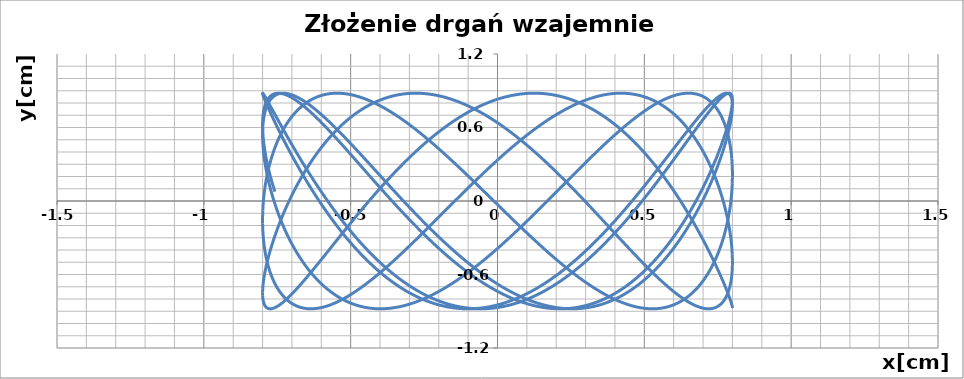
| Category | Zlożenie drgań wzajemnie prostopadłych |
|---|---|
| 0.8 | -0.873 |
| 0.7996728383013441 | -0.865 |
| 0.7986916207923187 | -0.853 |
| 0.7970571500148915 | -0.839 |
| 0.7947707628096523 | -0.821 |
| 0.7918343292224058 | -0.8 |
| 0.788250250974653 | -0.776 |
| 0.7840214594992129 | -0.75 |
| 0.7791514135425914 | -0.72 |
| 0.773644096336058 | -0.688 |
| 0.7675040123377433 | -0.653 |
| 0.7607361835484243 | -0.616 |
| 0.7533461454040083 | -0.576 |
| 0.7453399422480764 | -0.535 |
| 0.7367241223881895 | -0.491 |
| 0.7275057327399992 | -0.446 |
| 0.7176923130635458 | -0.399 |
| 0.7072918897964569 | -0.35 |
| 0.6963129694890893 | -0.3 |
| 0.6847645318469862 | -0.249 |
| 0.6726560223863368 | -0.197 |
| 0.6599973447084498 | -0.144 |
| 0.6467988523995545 | -0.091 |
| 0.6330713405625599 | -0.038 |
| 0.6188260369876929 | 0.016 |
| 0.6040745929692424 | 0.07 |
| 0.5888290737759149 | 0.123 |
| 0.573101948782601 | 0.176 |
| 0.5569060812716201 | 0.228 |
| 0.5402547179117876 | 0.28 |
| 0.5231614779239077 | 0.33 |
| 0.5056403419415553 | 0.379 |
| 0.48770564057625637 | 0.427 |
| 0.46937204269642 | 0.473 |
| 0.45065454342960803 | 0.518 |
| 0.43156845189795734 | 0.56 |
| 0.41212937869678345 | 0.6 |
| 0.39235322312660825 | 0.639 |
| 0.3722561601890553 | 0.674 |
| 0.3518546273572454 | 0.708 |
| 0.3311653111315202 | 0.738 |
| 0.31020513339148065 | 0.766 |
| 0.28899123755551054 | 0.791 |
| 0.26754097455910236 | 0.813 |
| 0.24587188866345178 | 0.832 |
| 0.2240017031059341 | 0.848 |
| 0.2019483056041915 | 0.861 |
| 0.17972973372569345 | 0.87 |
| 0.15736416013473367 | 0.877 |
| 0.1348698777289306 | 0.88 |
| 0.11226528467738939 | 0.879 |
| 0.08956886937276046 | 0.876 |
| 0.06679919530950444 | 0.869 |
| 0.04397488590073284 | 0.859 |
| 0.021114609246037332 | 0.846 |
| -0.0017629371372264759 | 0.83 |
| -0.02463904160671901 | 0.81 |
| -0.04749499369944862 | 0.788 |
| -0.07031209943513714 | 0.762 |
| -0.09307169660610766 | 0.734 |
| -0.1157551700411817 | 0.703 |
| -0.1383439668311087 | 0.669 |
| -0.16081961150306767 | 0.633 |
| -0.1831637211318351 | 0.595 |
| -0.20535802037525863 | 0.554 |
| -0.22738435642173527 | 0.511 |
| -0.24922471383747524 | 0.467 |
| -0.27086122930140005 | 0.42 |
| -0.29227620621562894 | 0.372 |
| -0.31345212917960247 | 0.323 |
| -0.3343716783160013 | 0.273 |
| -0.3550177434367494 | 0.221 |
| -0.3753734380375081 | 0.169 |
| -0.39542211310922004 | 0.116 |
| -0.41514737075540487 | 0.062 |
| -0.4345330776040672 | 0.008 |
| -0.45356337800325114 | -0.045 |
| -0.4722227069894466 | -0.099 |
| -0.4904958030182351 | -0.152 |
| -0.5083677204467759 | -0.205 |
| -0.5258238417579086 | -0.256 |
| -0.542849889515883 | -0.307 |
| -0.5594319380439343 | -0.357 |
| -0.5755564248141536 | -0.405 |
| -0.5912101615403362 | -0.452 |
| -0.606380344964738 | -0.498 |
| -0.6210545673299144 | -0.541 |
| -0.6352208265270765 | -0.582 |
| -0.648867535912668 | -0.621 |
| -0.6619835337851295 | -0.658 |
| -0.6745580925141024 | -0.693 |
| -0.6865809273146026 | -0.724 |
| -0.6980422046589903 | -0.754 |
| -0.7089325503198535 | -0.78 |
| -0.7192430570372284 | -0.803 |
| -0.7289652918038864 | -0.824 |
| -0.7380913027627248 | -0.841 |
| -0.7466136257106255 | -0.855 |
| -0.7545252902034583 | -0.866 |
| -0.7618198252572363 | -0.874 |
| -0.7684912646407618 | -0.879 |
| -0.7745341517554319 | -0.88 |
| -0.7799435440982134 | -0.878 |
| -0.7847150173041378 | -0.873 |
| -0.7888446687650067 | -0.864 |
| -0.7923291208213534 | -0.852 |
| -0.7951655235250439 | -0.837 |
| -0.7973515569702614 | -0.819 |
| -0.7988854331909679 | -0.798 |
| -0.7997658976232888 | -0.774 |
| -0.7999922301316255 | -0.747 |
| -0.7995642455976587 | -0.718 |
| -0.798482294071756 | -0.685 |
| -0.796747260486665 | -0.65 |
| -0.7943605639337235 | -0.613 |
| -0.7913241565021769 | -0.573 |
| -0.7876405216825586 | -0.531 |
| -0.7833126723354301 | -0.487 |
| -0.7783441482271516 | -0.442 |
| -0.7727390131346908 | -0.395 |
| -0.7665018515218428 | -0.346 |
| -0.7596377647895776 | -0.296 |
| -0.7521523671035828 | -0.245 |
| -0.7440517808024135 | -0.193 |
| -0.735342631390006 | -0.14 |
| -0.7260320421166492 | -0.087 |
| -0.7161276281528484 | -0.033 |
| -0.7056374903608451 | 0.021 |
| -0.6945702086688872 | 0.074 |
| -0.6829348350536695 | 0.128 |
| -0.6707408861366831 | 0.18 |
| -0.6579983354005304 | 0.233 |
| -0.6447176050315715 | 0.284 |
| -0.6309095573955734 | 0.334 |
| -0.616585486153336 | 0.383 |
| -0.6017571070235571 | 0.431 |
| -0.5864365482004978 | 0.477 |
| -0.5706363404342806 | 0.521 |
| -0.5543694067819346 | 0.563 |
| -0.537649052037575 | 0.604 |
| -0.5204889518503515 | 0.642 |
| -0.5029031415390804 | 0.677 |
| -0.484906004612696 | 0.71 |
| -0.46651226100591753 | 0.741 |
| -0.44773695503975275 | 0.768 |
| -0.42859544311668324 | 0.793 |
| -0.409103381160598 | 0.815 |
| -0.38927671181174683 | 0.834 |
| -0.36913165138718607 | 0.849 |
| -0.3486846766173871 | 0.862 |
| -0.3279525111698445 | 0.871 |
| -0.3069521119707205 | 0.877 |
| -0.28570065533569977 | 0.88 |
| -0.26421552292141154 | 0.879 |
| -0.24251428750889836 | 0.876 |
| -0.22061469863076077 | 0.868 |
| -0.19853466805374184 | 0.858 |
| -0.17629225512861652 | 0.845 |
| -0.15390565201937173 | 0.828 |
| -0.1313931688237584 | 0.808 |
| -0.10877321859738465 | 0.786 |
| -0.08606430229359867 | 0.76 |
| -0.06328499363148406 | 0.732 |
| -0.040453923904328976 | 0.7 |
| -0.017589766741019277 | 0.667 |
| 0.0052887771672053 | 0.63 |
| 0.028162995362126 | 0.592 |
| 0.05101417892354049 | 0.551 |
| 0.07382363777137599 | 0.508 |
| 0.09657271595237445 | 0.463 |
| 0.11924280689888661 | 0.417 |
| 0.14181536864725558 | 0.368 |
| 0.16427193900336778 | 0.319 |
| 0.1865941506429667 | 0.268 |
| 0.20876374613435514 | 0.217 |
| 0.23076259287123724 | 0.164 |
| 0.25257269790344355 | 0.111 |
| 0.2741762226534494 | 0.058 |
| 0.2955554975066192 | 0.004 |
| 0.31669303626325984 | -0.05 |
| 0.33757155044066084 | -0.103 |
| 0.35817396341341085 | -0.156 |
| 0.37848342438044913 | -0.209 |
| 0.39848332214740384 | -0.261 |
| 0.418157298712959 | -0.311 |
| 0.4374892626481332 | -0.361 |
| 0.45646340225752874 | -0.409 |
| 0.4750641985117809 | -0.456 |
| 0.4932764377406443 | -0.501 |
| 0.5110852240763121 | -0.544 |
| 0.5284759916368128 | -0.585 |
| 0.5454345164395072 | -0.624 |
| 0.5619469280349405 | -0.661 |
| 0.5779997208515487 | -0.695 |
| 0.5935797652419148 | -0.727 |
| 0.6086743182215709 | -0.756 |
| 0.6232710338915324 | -0.782 |
| 0.6373579735360657 | -0.805 |
| 0.650923615387415 | -0.825 |
| 0.6639568640494998 | -0.842 |
| 0.6764470595728935 | -0.856 |
| 0.688383986173635 | -0.867 |
| 0.6997578805887661 | -0.875 |
| 0.7105594400617439 | -0.879 |
| 0.7207798299512045 | -0.88 |
| 0.7304106909568564 | -0.878 |
| 0.739444145956583 | -0.872 |
| 0.7478728064491786 | -0.863 |
| 0.7556897785974329 | -0.851 |
| 0.7628886688666299 | -0.836 |
| 0.7694635892538473 | -0.818 |
| 0.7754091621037792 | -0.796 |
| 0.7807205245071426 | -0.772 |
| 0.7853933322780728 | -0.745 |
| 0.7894237635072499 | -0.715 |
| 0.7928085216878559 | -0.682 |
| 0.7955448384118011 | -0.647 |
| 0.7976304756340166 | -0.61 |
| 0.7990637275029616 | -0.57 |
| 0.7998434217558459 | -0.528 |
| 0.7999689206774291 | -0.484 |
| 0.79944012162161 | -0.438 |
| 0.7982574570953824 | -0.391 |
| 0.7964218944050843 | -0.342 |
| 0.7939349348652353 | -0.292 |
| 0.790798612570604 | -0.241 |
| 0.7870154927325143 | -0.188 |
| 0.782588669580747 | -0.136 |
| 0.7775217638327575 | -0.082 |
| 0.771818919732274 | -0.029 |
| 0.7654848016597043 | 0.025 |
| 0.7585245903171187 | 0.079 |
| 0.7509439784909322 | 0.132 |
| 0.7427491663957491 | 0.185 |
| 0.7339468566031824 | 0.237 |
| 0.7245442485597919 | 0.288 |
| 0.7145490326986255 | 0.338 |
| 0.703969384149183 | 0.387 |
| 0.6928139560509396 | 0.435 |
| 0.6810918724759114 | 0.481 |
| 0.6688127209660328 | 0.525 |
| 0.6559865446914688 | 0.567 |
| 0.6426238342362638 | 0.607 |
| 0.628735519018044 | 0.645 |
| 0.6143329583488069 | 0.68 |
| 0.5994279321440843 | 0.713 |
| 0.5840326312881069 | 0.743 |
| 0.5681596476628227 | 0.77 |
| 0.5518219638489454 | 0.795 |
| 0.5350329425074476 | 0.816 |
| 0.5178063154501794 | 0.835 |
| 0.5001561724085681 | 0.85 |
| 0.4820969495095606 | 0.863 |
| 0.46364341746825705 | 0.872 |
| 0.4448106695068795 | 0.877 |
| 0.42561410900996144 | 0.88 |
| 0.4060694369258537 | 0.879 |
| 0.3861926389248547 | 0.875 |
| 0.3659999723244568 | 0.868 |
| 0.34550795279242585 | 0.857 |
| 0.3247333408385574 | 0.843 |
| 0.30369312810619087 | 0.827 |
| 0.2824045234746722 | 0.807 |
| 0.2608849389841319 | 0.784 |
| 0.2391519755941134 | 0.758 |
| 0.21722340878766278 | 0.729 |
| 0.1951171740326958 | 0.698 |
| 0.17285135211249578 | 0.664 |
| 0.15044415433736405 | 0.627 |
| 0.12791390764951904 | 0.588 |
| 0.10527903963340178 | 0.547 |
| 0.08255806344368688 | 0.504 |
| 0.05976956266328699 | 0.459 |
| 0.036932176103765 | 0.413 |
| 0.01406458256057008 | 0.364 |
| -0.00881451446442835 | 0.315 |
| -0.03168640206061497 | 0.264 |
| -0.05453237321399405 | 0.213 |
| -0.07733374210774274 | 0.16 |
| -0.10007185940541297 | 0.107 |
| -0.12272812750430634 | 0.053 |
| -0.14528401574653244 | 0 |
| -0.16772107557530916 | -0.054 |
| -0.1900209556241232 | -0.107 |
| -0.21216541672638028 | -0.161 |
| -0.23413634683330808 | -0.213 |
| -0.25591577582786673 | -0.265 |
| -0.277485890222595 | -0.315 |
| -0.29882904772932617 | -0.365 |
| -0.31992779168890145 | -0.413 |
| -0.34076486534903494 | -0.46 |
| -0.361323225978695 | -0.505 |
| -0.38158605880741614 | -0.548 |
| -0.4015367907781813 | -0.589 |
| -0.4211591041025856 | -0.628 |
| -0.4404369496072345 | -0.664 |
| -0.4593545598604224 | -0.698 |
| -0.4778964620683859 | -0.729 |
| -0.49604749073057053 | -0.758 |
| -0.5137928000435504 | -0.784 |
| -0.5311178760434826 | -0.807 |
| -0.5480085484771314 | -0.827 |
| -0.5644510023917858 | -0.844 |
| -0.5804317894345646 | -0.857 |
| -0.5959378388518792 | -0.868 |
| -0.6109564681800643 | -0.875 |
| -0.6254753936184126 | -0.879 |
| -0.6394827400761508 | -0.88 |
| -0.6529670508851285 | -0.877 |
| -0.6659172971702705 | -0.872 |
| -0.6783228868701466 | -0.862 |
| -0.6901736734002584 | -0.85 |
| -0.7014599639519764 | -0.835 |
| -0.7121725274203301 | -0.816 |
| -0.722302601954167 | -0.795 |
| -0.7318419021225059 | -0.77 |
| -0.7407826256912302 | -0.743 |
| -0.749117460004564 | -0.712 |
| -0.7568395879661284 | -0.68 |
| -0.7639426936146695 | -0.644 |
| -0.770420967289914 | -0.606 |
| -0.7762691103843116 | -0.566 |
| -0.7814823396767903 | -0.524 |
| -0.7860563912449725 | -0.48 |
| -0.7899875239526576 | -0.434 |
| -0.7932725225097091 | -0.387 |
| -0.7959087001018569 | -0.338 |
| -0.7978939005882539 | -0.288 |
| -0.7992265002649913 | -0.236 |
| -0.7999054091931349 | -0.184 |
| -0.7999300720901892 | -0.131 |
| -0.7993004687842657 | -0.078 |
| -0.7980171142305822 | -0.024 |
| -0.7960810580902784 | 0.029 |
| -0.7934938838718926 | 0.083 |
| -0.790257707636205 | 0.136 |
| -0.7863751762655018 | 0.189 |
| -0.7818494652986789 | 0.241 |
| -0.7766842763339551 | 0.292 |
| -0.7708838340013188 | 0.342 |
| -0.7644528825071872 | 0.391 |
| -0.7573966817540962 | 0.439 |
| -0.7497210030386076 | 0.484 |
| -0.7414321243309389 | 0.528 |
| -0.7325368251401846 | 0.57 |
| -0.7230423809693275 | 0.61 |
| -0.7129565573645746 | 0.648 |
| -0.7022876035638835 | 0.683 |
| -0.6910442457498763 | 0.715 |
| -0.6792356799126527 | 0.745 |
| -0.6668715643283591 | 0.772 |
| -0.6539620116596386 | 0.797 |
| -0.6405175806844396 | 0.818 |
| -0.6265492676599522 | 0.836 |
| -0.6120684973287155 | 0.851 |
| -0.59708711357428 | 0.863 |
| -0.5816173697340371 | 0.872 |
| -0.5656719185771691 | 0.878 |
| -0.549263801955894 | 0.88 |
| -0.5324064401384714 | 0.879 |
| -0.515113620832721 | 0.875 |
| -0.49739948790898947 | 0.867 |
| -0.4792785298318216 | 0.856 |
| -0.46076556780978106 | 0.842 |
| -0.44187574367312216 | 0.825 |
| -0.4226245074892269 | 0.805 |
| -0.403027604925921 | 0.782 |
| -0.38310106437303293 | 0.756 |
| -0.3628611838327031 | 0.727 |
| -0.3423245175891757 | 0.695 |
| -0.32150786266898185 | 0.661 |
| -0.3004282451025828 | 0.624 |
| -0.2791029059987038 | 0.585 |
| -0.25754928744276157 | 0.544 |
| -0.2357850182308981 | 0.501 |
| -0.21382789945132946 | 0.456 |
| -0.19169588992475084 | 0.409 |
| -0.16940709151573796 | 0.361 |
| -0.1469797343271648 | 0.311 |
| -0.12443216178971402 | 0.26 |
| -0.10178281565871826 | 0.208 |
| -0.07905022093055884 | 0.156 |
| -0.056252970691002484 | 0.103 |
| -0.03340971090783467 | 0.049 |
| -0.010539125180233496 | -0.005 |
| 0.012340080542608468 | -0.058 |
| 0.03520919326117075 | -0.112 |
| 0.05804950823104254 | -0.165 |
| 0.0808423442616168 | -0.217 |
| 0.10356905899551255 | -0.269 |
| 0.12621106415623537 | -0.32 |
| 0.14874984075161043 | -0.369 |
| 0.17116695422054912 | -0.417 |
| 0.193444069510745 | -0.463 |
| 0.2155629660750007 | -0.508 |
| 0.23750555277388674 | -0.551 |
| 0.25925388267255844 | -0.592 |
| 0.2807901677196343 | -0.631 |
| 0.3020967932961149 | -0.667 |
| 0.32315633262246485 | -0.701 |
| 0.3439515610120343 | -0.732 |
| 0.36446546995921353 | -0.76 |
| 0.38468128105075816 | -0.786 |
| 0.40458245968892853 | -0.809 |
| 0.4241527286152044 | -0.828 |
| 0.44337608122352085 | -0.845 |
| 0.46223679465214706 | -0.858 |
| 0.4807194426434741 | -0.869 |
| 0.49880890816121826 | -0.876 |
| 0.5164903957547179 | -0.879 |
| 0.5337494436601807 | -0.88 |
| 0.5505719356290322 | -0.877 |
| 0.566944112473651 | -0.871 |
| 0.5828525833210698 | -0.862 |
| 0.5982843365654263 | -0.849 |
| 0.6132267505102078 | -0.833 |
| 0.6276676036915927 | -0.815 |
| 0.6415950848744408 | -0.793 |
| 0.6549978027127459 | -0.768 |
| 0.6678647950666723 | -0.74 |
| 0.6801855379685332 | -0.71 |
| 0.6919499542303864 | -0.677 |
| 0.7031484216862123 | -0.641 |
| 0.7137717810619213 | -0.603 |
| 0.7238113434667695 | -0.563 |
| 0.7332588975000298 | -0.521 |
| 0.7421067159671383 | -0.477 |
| 0.7503475621997966 | -0.431 |
| 0.7579746959748758 | -0.383 |
| 0.7649818790272719 | -0.334 |
| 0.7713633801522085 | -0.284 |
| 0.7771139798928164 | -0.232 |
| 0.7822289748091467 | -0.18 |
| 0.7867041813251352 | -0.127 |
| 0.7905359391503687 | -0.074 |
| 0.7937211142738496 | -0.02 |
| 0.7962571015273181 | 0.034 |
| 0.7981418267160301 | 0.087 |
| 0.7993737483152499 | 0.141 |
| 0.7999518587310702 | 0.193 |
| 0.7998756851245269 | 0.245 |
| 0.799145289798336 | 0.296 |
| 0.7977612701459367 | 0.346 |
| 0.7957247581628801 | 0.395 |
| 0.7930374195209656 | 0.442 |
| 0.7897014522058803 | 0.488 |
| 0.785719584719458 | 0.532 |
| 0.7810950738480253 | 0.573 |
| 0.7758317019986634 | 0.613 |
| 0.7699337741055583 | 0.651 |
| 0.7634061141089805 | 0.685 |
| 0.756254061009762 | 0.718 |
| 0.7484834645025052 | 0.748 |
| 0.7401006801910923 | 0.775 |
| 0.7311125643904092 | 0.799 |
| 0.7215264685185399 | 0.82 |
| 0.7113502330840055 | 0.838 |
| 0.7005921812729833 | 0.853 |
| 0.6892611121417359 | 0.864 |
| 0.6773662934198239 | 0.873 |
| 0.6649174539299922 | 0.878 |
| 0.6519247756309262 | 0.88 |
| 0.6383988852893818 | 0.879 |
| 0.6243508457885105 | 0.874 |
| 0.609792147079474 | 0.866 |
| 0.5947346967837732 | 0.855 |
| 0.5791908104539499 | 0.841 |
| 0.5631732015006404 | 0.824 |
| 0.5466949707942307 | 0.803 |
| 0.5297695959495906 | 0.78 |
| 0.5124109203026838 | 0.753 |
| 0.49463314158803534 | 0.724 |
| 0.4764508003263533 | 0.692 |
| 0.4578787679317715 | 0.658 |
| 0.4389322345484497 | 0.621 |
| 0.4196266966265036 | 0.582 |
| 0.3999779442473831 | 0.54 |
| 0.38000204820910155 | 0.497 |
| 0.35971534688185786 | 0.452 |
| 0.3391344328448167 | 0.405 |
| 0.3182761393149711 | 0.357 |
| 0.29715752637917436 | 0.307 |
| 0.275795867040631 | 0.256 |
| 0.25420863309123076 | 0.204 |
| 0.2324134808212926 | 0.151 |
| 0.21042823657841297 | 0.098 |
| 0.18827088218722288 | 0.045 |
| 0.16595954024197315 | -0.009 |
| 0.1435124592839919 | -0.063 |
| 0.12094799887611374 | -0.116 |
| 0.09828461458633218 | -0.169 |
| 0.0755408428929025 | -0.221 |
| 0.05273528602327452 | -0.273 |
| 0.029886596739261757 | -0.324 |
| 0.007013463080856908 | -0.373 |
| -0.015865406918784002 | -0.421 |
| -0.038731300534732796 | -0.467 |
| -0.06156551565549633 | -0.512 |
| -0.08434937607955582 | -0.555 |
| -0.10706424679072124 | -0.595 |
| -0.12969154919977322 | -0.634 |
| -0.15221277633998134 | -0.67 |
| -0.17460950800402678 | -0.703 |
| -0.19686342580997196 | -0.734 |
| -0.21895632818394045 | -0.762 |
| -0.24087014524725858 | -0.788 |
| -0.26258695359588885 | -0.81 |
| -0.2840889909600621 | -0.83 |
| -0.30535867073210415 | -0.846 |
| -0.32637859635060607 | -0.859 |
| -0.34713157552914164 | -0.869 |
| -0.3676006343179091 | -0.876 |
| -0.38776903098680043 | -0.879 |
| -0.4076202697185296 | -0.88 |
| -0.427138114100642 | -0.877 |
| -0.4463066004053296 | -0.87 |
| -0.4651100506462422 | -0.861 |
| -0.4835330854015751 | -0.848 |
| -0.5015606363929671 | -0.832 |
| -0.519177958809907 | -0.813 |
| -0.5363706433695733 | -0.791 |
| -0.5531246281022556 | -0.766 |
| -0.569426209852692 | -0.738 |
| -0.5852620554879396 | -0.707 |
| -0.6006192128026084 | -0.674 |
| -0.6154851211125123 | -0.638 |
| -0.6298476215281146 | -0.6 |
| -0.6436949668993318 | -0.56 |
| -0.6570158314235814 | -0.517 |
| -0.6697993199092008 | -0.473 |
| -0.6820349766866699 | -0.427 |
| -0.6937127941603491 | -0.379 |
| -0.7048232209937368 | -0.33 |
| -0.7153571699215425 | -0.279 |
| -0.725306025182205 | -0.228 |
| -0.7346616495647581 | -0.176 |
| -0.7434163910642885 | -0.123 |
| -0.7515630891405456 | -0.069 |
| -0.7590950805745758 | -0.016 |
| -0.7660062049186015 | 0.038 |
| -0.7722908095346717 | 0.092 |
| -0.7779437542179822 | 0.145 |
| -0.7829604154010705 | 0.198 |
| -0.7873366899354513 | 0.249 |
| -0.7910689984475985 | 0.3 |
| -0.7941542882665301 | 0.35 |
| -0.7965900359206013 | 0.399 |
| -0.7983742492014618 | 0.446 |
| -0.7995054687934924 | 0.492 |
| -0.7999827694673848 | 0.535 |
| -0.7998057608368909 | 0.577 |
| -0.7989745876781216 | 0.616 |
| -0.7974899298111326 | 0.653 |
| -0.7953530015438989 | 0.688 |
| -0.7925655506791243 | 0.72 |
| -0.7891298570847085 | 0.75 |
| -0.7850487308290329 | 0.777 |
| -0.7803255098825926 | 0.8 |
| -0.7749640573878582 | 0.821 |
| -0.7689687584995929 | 0.839 |
| -0.7623445167982168 | 0.854 |
| -0.7550967502791488 | 0.865 |
| -0.7472313869214033 | 0.873 |
| -0.7387548598390732 | 0.878 |
| -0.7296741020196537 | 0.88 |
| -0.7199965406535289 | 0.878 |
| -0.7097300910592376 | 0.874 |
| -0.6988831502095006 | 0.865 |
| -0.6874645898633035 | 0.854 |
| -0.6754837493096413 | 0.84 |
| -0.6629504277288822 | 0.822 |
| -0.649874876177972 | 0.801 |
| -0.6362677892060526 | 0.778 |
| -0.6221402961073399 | 0.751 |
| -0.607503951818435 | 0.722 |
| -0.5923707274674871 | 0.69 |
| -0.5767530005829603 | 0.655 |
| -0.5606635449699924 | 0.618 |
| -0.5441155202626572 | 0.579 |
| -0.5271224611606387 | 0.537 |
| -0.5096982663591353 | 0.493 |
| -0.49185718718107174 | 0.448 |
| -0.4736138159208723 | 0.401 |
| -0.4549830739093662 | 0.353 |
| -0.43598019930955795 | 0.303 |
| -0.41662073465328336 | 0.252 |
| -0.3969205141288976 | 0.2 |
| -0.3768956506304273 | 0.147 |
| -0.35656252257876875 | 0.094 |
| -0.33593776052569774 | 0.04 |
| -0.31503823355168603 | -0.013 |
| -0.29388103546859845 | -0.067 |
| -0.2724834708385941 | -0.12 |
| -0.2508630408206543 | -0.173 |
| -0.22903742885629963 | -0.226 |
| -0.20702448620624386 | -0.277 |
| -0.1848422173497615 | -0.328 |
| -0.16250876525875044 | -0.377 |
| -0.14004239655852077 | -0.425 |
| -0.11746148658743348 | -0.471 |
| -0.09478450436764967 | -0.515 |
| -0.07202999749923071 | -0.558 |
| -0.04921657698996883 | -0.598 |
| -0.02636290203338177 | -0.637 |
| -0.003487664747270692 | -0.673 |
| 0.019390425114650875 | -0.706 |
| 0.04225265546552701 | -0.737 |
| 0.06508032719006607 | -0.765 |
| 0.08785476943862083 | -0.79 |
| 0.11055735489816698 | -0.812 |
| 0.13316951502764465 | -0.831 |
| 0.1556727552452582 | -0.847 |
| 0.17804867005527047 | -0.86 |
| 0.2002789581019332 | -0.87 |
| 0.22234543713825447 | -0.876 |
| 0.2442300588973193 | -0.88 |
| 0.2659149238540549 | -0.88 |
| 0.28738229586532527 | -0.876 |
| 0.3086146166763956 | -0.87 |
| 0.3295945202819137 | -0.86 |
| 0.350304847129624 | -0.847 |
| 0.3707286581552484 | -0.831 |
| 0.3908492486370164 | -0.811 |
| 0.41065016185852565 | -0.789 |
| 0.43011520256876995 | -0.764 |
| 0.4492284502282887 | -0.736 |
| 0.46797427203065195 | -0.705 |
| 0.4863373356886054 | -0.671 |
| 0.5043026219743995 | -0.635 |
| 0.521855437004089 | -0.597 |
| 0.5389814242557186 | -0.556 |
| 0.5556665763115913 | -0.514 |
| 0.5718972463149831 | -0.469 |
| 0.5876601591319699 | -0.423 |
| 0.6029424222092237 | -0.375 |
| 0.617731536118873 | -0.326 |
| 0.6320154047818471 | -0.275 |
| 0.6457823453613084 | -0.224 |
| 0.6590210978180918 | -0.171 |
| 0.6717208341203461 | -0.118 |
| 0.6838711670998167 | -0.065 |
| 0.6954621589475602 | -0.011 |
| 0.7064843293421259 | 0.042 |
| 0.7169286632035354 | 0.096 |
| 0.7267866180667752 | 0.149 |
| 0.7360501310686947 | 0.202 |
| 0.7447116255426731 | 0.254 |
| 0.7527640172156002 | 0.305 |
| 0.7602007200021268 | 0.354 |
| 0.7670156513914658 | 0.403 |
| 0.7732032374222924 | 0.45 |
| 0.7787584172417147 | 0.495 |
| 0.783676647244569 | 0.539 |
| 0.7879539047896493 | 0.58 |
| 0.7915866914898457 | 0.619 |
| 0.7945720360734884 | 0.656 |
| 0.7969074968145655 | 0.691 |
| 0.7985911635298186 | 0.723 |
| 0.7996216591410915 | 0.752 |
| 0.7999981408016477 | 0.779 |
| 0.799720300585538 | 0.802 |
| 0.7987883657394551 | 0.823 |
| 0.7972030984968672 | 0.84 |
| 0.7949657954545845 | 0.855 |
| 0.7920782865122651 | 0.866 |
| 0.7885429333757369 | 0.874 |
| 0.7843626276253427 | 0.879 |
| 0.7795407883509069 | 0.88 |
| 0.7740813593552511 | 0.878 |
| 0.7679888059285322 | 0.873 |
| 0.761268111196074 | 0.865 |
| 0.7539247720426369 | 0.853 |
| 0.7459647946164971 | 0.838 |
| 0.7373946894169986 | 0.82 |
| 0.7282214659695749 | 0.8 |
| 0.7184526270926406 | 0.776 |
| 0.7080961627609985 | 0.749 |
| 0.6971605435708035 | 0.719 |
| 0.6856547138114321 | 0.687 |
| 0.6735880841499055 | 0.652 |
| 0.6609705239338681 | 0.615 |
| 0.6478123531193998 | 0.575 |
| 0.6341243338302892 | 0.534 |
| 0.6199176615556428 | 0.49 |
| 0.6052039559930393 | 0.444 |
| 0.5899952515447494 | 0.397 |
| 0.5743039874747219 | 0.349 |
| 0.5581429977344763 | 0.299 |
| 0.5415255004661533 | 0.247 |
| 0.5244650871913311 | 0.196 |
| 0.506975711694485 | 0.143 |
| 0.48907167861010054 | 0.09 |
| 0.47076763172286507 | 0.036 |
| 0.4520785419904674 | -0.018 |
| 0.43301969529875617 | -0.071 |
| 0.4136066799593861 | -0.125 |
| 0.39385537396003856 | -0.178 |
| 0.3737819319777622 | -0.23 |
| 0.35340277216600896 | -0.281 |
| 0.33273456272612423 | -0.332 |
| 0.31179420827438187 | -0.381 |
| 0.2905988360156167 | -0.428 |
| 0.26916578173480316 | -0.475 |
| 0.2475125756180585 | -0.519 |
| 0.225656927914619 | -0.561 |
| 0.20361671445155716 | -0.602 |
| 0.18140996201305576 | -0.64 |
| 0.15905483359624106 | -0.675 |
| 0.13656961355557937 | -0.709 |
| 0.11397269264802856 | -0.739 |
| 0.09128255299116277 | -0.767 |
| 0.06851775294655853 | -0.792 |
| 0.04569691194084907 | -0.814 |
| 0.022838695236807698 | -0.833 |
| -3.8201333061260275e-05 | -0.848 |
| -0.022915066657892 | -0.861 |
| -0.04577318965239121 | -0.871 |
| -0.06859387456069714 | -0.877 |
| -0.09135845624770073 | -0.88 |
| -0.11404831546537847 | -0.879 |
| -0.13664489408150932 | -0.876 |
| -0.15912971025848924 | -0.869 |
| -0.18148437356968772 | -0.859 |
| -0.2036906000410392 | -0.846 |
| -0.22573022710561919 | -0.829 |
| -0.2475852284588545 | -0.81 |
| -0.26923772880232527 | -0.787 |
| -0.2906700184640556 | -0.761 |
| -0.31186456788331324 | -0.733 |
| -0.3328040419481226 | -0.702 |
| -0.35347131417372096 | -0.668 |
| -0.3738494807103938 | -0.632 |
| -0.39392187416918945 | -0.594 |
| -0.4136720772542577 | -0.553 |
| -0.43308393619062324 | -0.51 |
| -0.45214157393642457 | -0.465 |
| -0.4708294031688232 | -0.419 |
| -0.489132139032927 | -0.371 |
| -0.5070348116433454 | -0.322 |
| -0.5245227783281308 | -0.271 |
| -0.5415817356050578 | -0.219 |
| -0.5581977308805309 | -0.167 |
| -0.5743571738614561 | -0.114 |
| -0.5900468476707877 | -0.061 |
| -0.6052539196576968 | -0.007 |
| -0.6199659518934185 | 0.047 |
| -0.6341709113443145 | 0.1 |
| -0.6478571797137298 | 0.153 |
| -0.6610135629446376 | 0.206 |
| -0.6736293003753282 | 0.258 |
| -0.6856940735405804 | 0.309 |
| -0.6971980146111866 | 0.358 |
| -0.7081317144648946 | 0.407 |
| -0.7184862303821613 | 0.454 |
| -0.7282530933604461 | 0.499 |
| -0.7374243150410424 | 0.542 |
| -0.7459923942427902 | 0.583 |
| -0.7539503230973267 | 0.622 |
| -0.7612915927808461 | 0.659 |
| -0.7680101988376987 | 0.694 |
| -0.7741006460914585 | 0.725 |
| -0.779557953139454 | 0.754 |
| -0.7843776564270746 | 0.781 |
| -0.7885558138985336 | 0.804 |
| -0.7920890082210931 | 0.824 |
| -0.7949743495801109 | 0.842 |
| -0.7972094780426373 | 0.856 |
| -0.7987925654876115 | 0.867 |
| -0.7997223171010885 | 0.874 |
| -0.7999979724352758 | 0.879 |
| -0.7996193060305049 | 0.88 |
| -0.7985866275996364 | 0.878 |
| -0.7969007817747439 | 0.872 |
| -0.7945631474162874 | 0.864 |
| -0.7915756364853354 | 0.852 |
| -0.7879406924797651 | 0.837 |
| -0.7836612884357157 | 0.819 |
| -0.7787409244959267 | 0.798 |
| -0.7731836250469601 | 0.774 |
| -0.7669939354276352 | 0.746 |
| -0.7601769182113767 | 0.717 |
| -0.7527381490655163 | 0.684 |
| -0.7446837121909264 | 0.649 |
| -0.7360201953457319 | 0.612 |
| -0.7267546844571511 | 0.572 |
| -0.7168947578258886 | 0.53 |
| -0.7064484799278052 | 0.486 |
| -0.6954243948179564 | 0.441 |
| -0.6838315191423703 | 0.393 |
| -0.6716793347632883 | 0.344 |
| -0.6589777810039262 | 0.294 |
| -0.6457372465190399 | 0.243 |
| -0.6319685607980083 | 0.191 |
| -0.6176829853073607 | 0.138 |
| -0.6028922042799492 | 0.085 |
| -0.5876083151583947 | 0.032 |
| -0.5718438187005112 | -0.022 |
| -0.5556116087548938 | -0.076 |
| -0.5389249617149973 | -0.129 |
| -0.5217975256602916 | -0.182 |
| -0.5042433091934622 | -0.234 |
| -0.48627666998270586 | -0.285 |
| -0.46791230301852416 | -0.336 |
| -0.4491652285946531 | -0.385 |
| -0.4300507800228691 | -0.432 |
| -0.41058459109183354 | -0.478 |
| -0.3907825832801414 | -0.522 |
| -0.37066095273406907 | -0.565 |
| -0.3502361570206919 | -0.605 |
| -0.3295249016671606 | -0.643 |
| -0.30854412649718466 | -0.678 |
| -0.2873109917758683 | -0.711 |
| -0.26584286417427205 | -0.741 |
| -0.2441573025651314 | -0.769 |
| -0.22227204366136918 | -0.794 |
| -0.20020498750919238 | -0.815 |
| -0.17797418284753333 | -0.834 |
| -0.15559781234592546 | -0.85 |
| -0.13309417773283752 | -0.862 |
| -0.11048168482657322 | -0.871 |
| -0.08777882848111895 | -0.877 |
| -0.0650041774590849 | -0.88 |
| -0.04217635924425206 | -0.879 |
| -0.019314044806091196 | -0.875 |
| 0.003564066671339204 | -0.868 |
| 0.026439263083503806 | -0.858 |
| 0.04929283471011154 | -0.844 |
| 0.07210608951788662 | -0.828 |
| 0.09486036844883075 | -0.808 |
| 0.11753706068158556 | -0.785 |
| 0.14011761885327131 | -0.759 |
| 0.16258357422946512 | -0.731 |
| 0.18491655180986552 | -0.699 |
| 0.2070982853572666 | -0.666 |
| 0.22911063233760204 | -0.629 |
| 0.2509355887587955 | -0.59 |
| 0.2725553038963128 | -0.55 |
| 0.2939520948933289 | -0.507 |
| 0.3151084612236205 | -0.462 |
| 0.33600709900533027 | -0.415 |
| 0.3566309151538572 | -0.367 |
| 0.3769630413623968 | -0.318 |
| 0.3969868478985846 | -0.267 |
| 0.4166859572060111 | -0.215 |
| 0.43604425729952834 | -0.163 |
| 0.4550459149432725 | -0.11 |
| 0.47367538860076847 | -0.056 |
| 0.49191744114640346 | -0.003 |
| 0.5097571523279241 | 0.051 |
| 0.5271799309698028 | 0.105 |
| 0.5441715269073979 | 0.158 |
| 0.5607180426422328 | 0.21 |
| 0.576805944708827 | 0.262 |
| 0.5924220747437525 | 0.313 |
| 0.607553660247944 | 0.362 |
| 0.6221883250333567 | 0.411 |
| 0.6363140993455132 | 0.457 |
| 0.6499194296536199 | 0.502 |
| 0.6629931881002389 | 0.546 |
| 0.6755246816028173 | 0.587 |
| 0.6875036605996012 | 0.626 |
| 0.6989203274328015 | 0.662 |
| 0.7097653443621315 | 0.696 |
| 0.7200298412021886 | 0.728 |
| 0.7297054225774211 | 0.757 |
| 0.7387841747887292 | 0.783 |
| 0.7472586722861281 | 0.806 |
| 0.7551219837421256 | 0.826 |
| 0.7623676777208882 | 0.843 |
| 0.7689898279385436 | 0.857 |
| 0.7749830181103035 | 0.867 |
| 0.7803423463804772 | 0.875 |
| 0.7850634293317144 | 0.879 |
| 0.7891424055702183 | 0.88 |
| 0.7925759388840035 | 0.878 |
| 0.79536122097159 | 0.872 |
| 0.7974959737389311 | 0.863 |
| 0.7989784511626733 | 0.851 |
| 0.7998074407182353 | 0.836 |
| 0.7999822643715397 | 0.817 |
| 0.7995027791335778 | 0.796 |
| 0.7983693771773623 | 0.771 |
| 0.796582985517166 | 0.744 |
| 0.7941450652503138 | 0.714 |
| 0.7910576103621452 | 0.681 |
| 0.787323146095125 | 0.646 |
| 0.7829447268834352 | 0.609 |
| 0.7779259338547428 | 0.569 |
| 0.77227087190118 | 0.527 |
| 0.7659841663219313 | 0.483 |
| 0.7590709590401907 | 0.437 |
| 0.7515369043975489 | 0.389 |
| 0.7433881645292937 | 0.34 |
| 0.7346314043243691 | 0.29 |
| 0.7252737859741303 | 0.239 |
| 0.7153229631143688 | 0.187 |
| 0.7047870745653572 | 0.134 |
| 0.6936747376750788 | 0.081 |
| 0.6819950412710718 | 0.027 |
| 0.6697575382266188 | -0.026 |
| 0.6569722376474342 | -0.08 |
| 0.6436495966851532 | -0.133 |
| 0.6298005119843919 | -0.186 |
| 0.6154363107703459 | -0.238 |
| 0.6005687415841827 | -0.29 |
| 0.5852099646738784 | -0.34 |
| 0.5693725420482934 | -0.389 |
| 0.5530694272026448 | -0.436 |
| 0.5363139545238004 | -0.482 |
| 0.5191198283840186 | -0.526 |
| 0.5015011119320888 | -0.568 |
| 0.4834722155910127 | -0.608 |
| 0.4650478852716724 | -0.646 |
| 0.44624319031207726 | -0.681 |
| 0.42707351115209174 | -0.714 |
| 0.40755452675370984 | -0.744 |
| 0.38770220177715636 | -0.771 |
| 0.3675327735233376 | -0.796 |
| 0.34706273865327725 | -0.817 |
| 0.3263088396954168 | -0.835 |
| 0.3052880513518583 | -0.851 |
| 0.2840175666146509 | -0.863 |
| 0.2625147827035836 | -0.872 |
| 0.24079728683694257 | -0.877 |
| 0.21888284184681284 | -0.88 |
| 0.1967893716508254 | -0.879 |
| 0.17453494659207117 | -0.875 |
| 0.15213776865930662 | -0.868 |
| 0.1296161565994869 | -0.857 |
| 0.10698853093474846 | -0.843 |
| 0.08427339889621673 | -0.826 |
| 0.06148933928685181 | -0.806 |
| 0.03865498728575827 | -0.783 |
| 0.015789019206409887 | -0.757 |
| -0.007089862778797704 | -0.728 |
| -0.029962945935127577 | -0.697 |
| -0.05281152227073811 | -0.663 |
| -0.07561690383801188 | -0.626 |
| -0.09836043801851875 | -0.587 |
| -0.12102352277906891 | -0.546 |
| -0.14358762188639193 | -0.503 |
| -0.16603428006801194 | -0.458 |
| -0.18834513810687648 | -0.411 |
| -0.2105019478574467 | -0.363 |
| -0.23248658717094373 | -0.314 |
| -0.2542810747175014 | -0.263 |
| -0.27586758469320743 | -0.211 |
| -0.29722846139988784 | -0.159 |
| -0.3183462336857618 | -0.105 |
| -0.3392036292352075 | -0.052 |
| -0.3597835886958209 | 0.002 |
| -0.38006927963136855 | 0.055 |
| -0.40004411028909337 | 0.109 |
| -0.41969174317016433 | 0.162 |
| -0.43899610839221925 | 0.215 |
| -0.4579414168329617 | 0.266 |
| -0.4765121730441617 | 0.317 |
| -0.4946931879254557 | 0.366 |
| -0.5124695911475614 | 0.414 |
| -0.5298268433147937 | 0.461 |
| -0.5467507478568928 | 0.506 |
| -0.5632274626404683 | 0.549 |
| -0.5792435112905258 | 0.59 |
| -0.59478579421286 | 0.629 |
| -0.6098415993082664 | 0.665 |
| -0.6243986123698191 | 0.699 |
| -0.6384449271547201 | 0.73 |
| -0.6519690551224555 | 0.759 |
| -0.6649599348313266 | 0.785 |
| -0.677406940985657 | 0.807 |
| -0.6892998931262487 | 0.827 |
| -0.700629063957044 | 0.844 |
| -0.7113851873011122 | 0.858 |
| -0.7215594656794873 | 0.868 |
| -0.7311435775066824 | 0.875 |
| -0.7401296838969286 | 0.879 |
| -0.7485104350756515 | 0.88 |
| -0.7562789763908735 | 0.877 |
| -0.763428953919659 | 0.871 |
| -0.7699545196650266 | 0.862 |
| -0.7758503363390403 | 0.85 |
| -0.7811115817282048 | 0.834 |
| -0.7857339526375746 | 0.816 |
| -0.7897136684103528 | 0.794 |
| -0.7930474740201086 | 0.769 |
| -0.7957326427330762 | 0.742 |
| -0.797766978338362 | 0.712 |
| -0.7991488169442359 | 0.679 |
| -0.7998770283390337 | 0.643 |
| -0.7999510169155633 | 0.605 |
| -0.7993707221582536 | 0.565 |
| -0.7981366186926508 | 0.523 |
| -0.7962497158972206 | 0.479 |
| -0.7937115570777723 | 0.433 |
| -0.7905242182051821 | 0.385 |
| -0.7866903062174511 | 0.336 |
| -0.7822129568874742 | 0.286 |
| -0.777095832258281 | 0.235 |
| -0.7713431176478389 | 0.183 |
| -0.7649595182258544 | 0.13 |
| -0.757950255165407 | 0.077 |